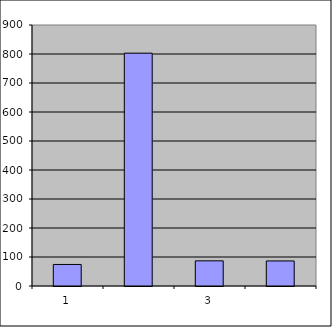
| Category | Series 0 |
|---|---|
| 0 | 74.25 |
| 1 | 802.873 |
| 2 | 86.768 |
| 3 | 86.42 |